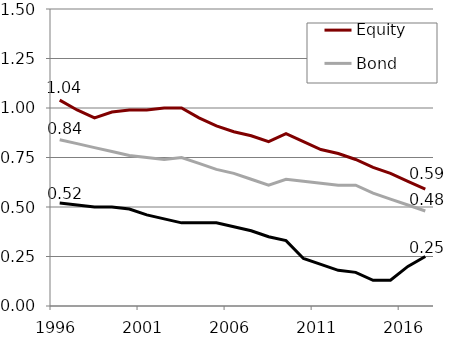
| Category | Equity | Bond | Money market |
|---|---|---|---|
| 1996.0 | 1.04 | 0.84 | 0.52 |
| 1997.0 | 0.99 | 0.82 | 0.51 |
| 1998.0 | 0.95 | 0.8 | 0.5 |
| 1999.0 | 0.98 | 0.78 | 0.5 |
| 2000.0 | 0.99 | 0.76 | 0.49 |
| 2001.0 | 0.99 | 0.75 | 0.46 |
| 2002.0 | 1 | 0.74 | 0.44 |
| 2003.0 | 1 | 0.75 | 0.42 |
| 2004.0 | 0.95 | 0.72 | 0.42 |
| 2005.0 | 0.91 | 0.69 | 0.42 |
| 2006.0 | 0.88 | 0.67 | 0.4 |
| 2007.0 | 0.86 | 0.64 | 0.38 |
| 2008.0 | 0.83 | 0.61 | 0.35 |
| 2009.0 | 0.87 | 0.64 | 0.33 |
| 2010.0 | 0.83 | 0.63 | 0.24 |
| 2011.0 | 0.79 | 0.62 | 0.21 |
| 2012.0 | 0.77 | 0.61 | 0.18 |
| 2013.0 | 0.74 | 0.61 | 0.17 |
| 2014.0 | 0.7 | 0.57 | 0.13 |
| 2015.0 | 0.67 | 0.54 | 0.13 |
| 2016.0 | 0.63 | 0.51 | 0.2 |
| 2017.0 | 0.59 | 0.48 | 0.25 |